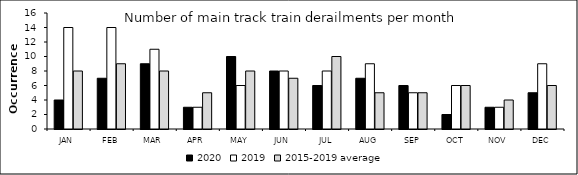
| Category | 2020 | 2019 | 2015-2019 average |
|---|---|---|---|
| JAN | 4 | 14 | 8 |
| FEB | 7 | 14 | 9 |
| MAR | 9 | 11 | 8 |
| APR | 3 | 3 | 5 |
| MAY | 10 | 6 | 8 |
| JUN | 8 | 8 | 7 |
| JUL | 6 | 8 | 10 |
| AUG | 7 | 9 | 5 |
| SEP | 6 | 5 | 5 |
| OCT | 2 | 6 | 6 |
| NOV | 3 | 3 | 4 |
| DEC | 5 | 9 | 6 |